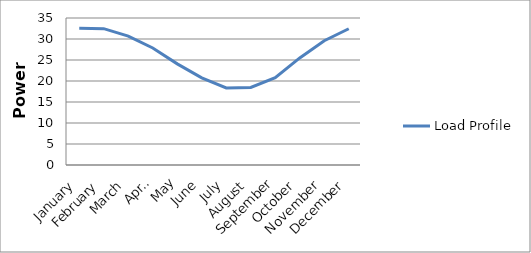
| Category | Load Profile | Boiler Cap. | Minimum power output | Mean Load |   |
|---|---|---|---|---|---|
| January | 32.567 |  |  |  |  |
| February | 32.46 |  |  |  |  |
| March | 30.687 |  |  |  |  |
| April | 27.866 |  |  |  |  |
| May | 24.077 |  |  |  |  |
| June | 20.732 |  |  |  |  |
| July | 18.341 |  |  |  |  |
| August | 18.475 |  |  |  |  |
| September | 20.786 |  |  |  |  |
| October | 25.488 |  |  |  |  |
| November | 29.598 |  |  |  |  |
| December | 32.446 |  |  |  |  |